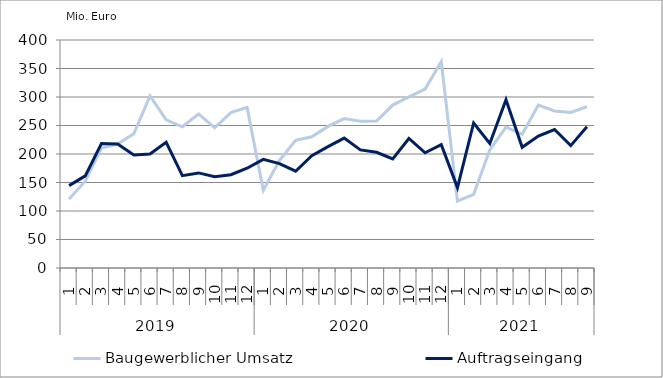
| Category | Baugewerblicher Umsatz | Auftragseingang |
|---|---|---|
| 0 | 120975.133 | 144510.881 |
| 1 | 152329.786 | 161685.201 |
| 2 | 210227.67 | 218455.879 |
| 3 | 217522.321 | 217610.064 |
| 4 | 235490.429 | 198110.439 |
| 5 | 301963.302 | 200012.086 |
| 6 | 259975.317 | 220559.061 |
| 7 | 247779.658 | 162059.723 |
| 8 | 270249.609 | 166829.611 |
| 9 | 245966.91 | 160120.773 |
| 10 | 272620.351 | 163589.389 |
| 11 | 281810.121 | 175051.247 |
| 12 | 136135.432 | 190647.086 |
| 13 | 188682.361 | 183141.14 |
| 14 | 224009.315 | 169770.009 |
| 15 | 230172.252 | 196979.845 |
| 16 | 248410.714 | 212955.83 |
| 17 | 262078.128 | 227853.487 |
| 18 | 257360.37 | 207209.188 |
| 19 | 257932.168 | 202976.091 |
| 20 | 285866.269 | 191463.844 |
| 21 | 300164.57 | 227245.467 |
| 22 | 313922.518 | 202060.636 |
| 23 | 362040.738 | 216296.504 |
| 24 | 117421.805 | 141020.655 |
| 25 | 129162.55 | 254416.876 |
| 26 | 207280.837 | 218451.405 |
| 27 | 247094.279 | 295077.868 |
| 28 | 234515.312 | 211696.129 |
| 29 | 285732.845 | 231455.155 |
| 30 | 275480.885 | 242932.505 |
| 31 | 272787.524 | 214636.944 |
| 32 | 282850.254 | 247827.991 |